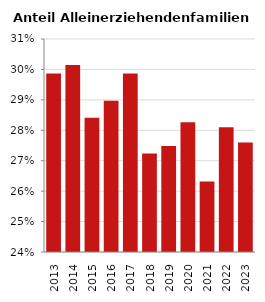
| Category | Anteil Alleinerziehende an Familien |
|---|---|
| 2013.0 | 0.299 |
| 2014.0 | 0.301 |
| 2015.0 | 0.284 |
| 2016.0 | 0.29 |
| 2017.0 | 0.299 |
| 2018.0 | 0.272 |
| 2019.0 | 0.275 |
| 2020.0 | 0.283 |
| 2021.0 | 0.263 |
| 2022.0 | 0.281 |
| 2023.0 | 0.276 |